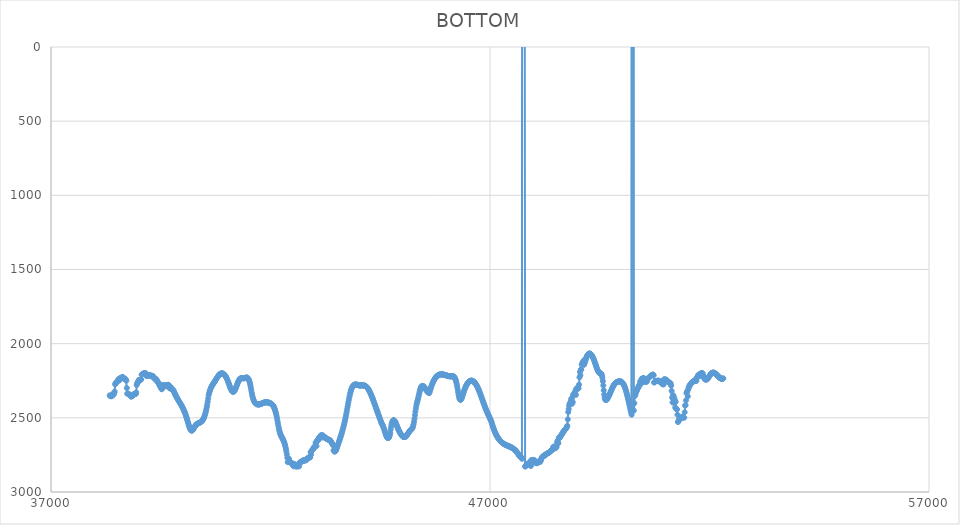
| Category | BOTTOM |
|---|---|
| 38337.5054 | 2348.22 |
| 38347.7454 | 2353.85 |
| 38357.9855 | 2353.85 |
| 38368.2256 | 2353.85 |
| 38378.4657 | 2353.85 |
| 38388.7057 | 2353.85 |
| 38398.9458 | 2344 |
| 38409.1859 | 2339.77 |
| 38419.426 | 2344 |
| 38429.666 | 2341.18 |
| 38439.9061 | 2332.74 |
| 38450.1462 | 2322.88 |
| 38460.3863 | 2273.62 |
| 38470.6263 | 2267.99 |
| 38480.8664 | 2263.76 |
| 38491.1065 | 2260.95 |
| 38501.3466 | 2258.13 |
| 38511.5866 | 2252.5 |
| 38521.8267 | 2252.5 |
| 38532.0668 | 2242.65 |
| 38542.3069 | 2241.24 |
| 38552.547 | 2237.02 |
| 38562.787 | 2246.87 |
| 38573.0271 | 2232.8 |
| 38583.2672 | 2229.98 |
| 38593.5073 | 2232.8 |
| 38603.7473 | 2231.39 |
| 38613.9874 | 2227.17 |
| 38624.2275 | 2227.17 |
| 38634.4676 | 2224.35 |
| 38644.7076 | 2228.57 |
| 38654.9477 | 2232.8 |
| 38665.1878 | 2235.61 |
| 38675.4279 | 2235.61 |
| 38685.6679 | 2237.02 |
| 38695.908 | 2239.83 |
| 38706.1481 | 2244.06 |
| 38716.3882 | 2249.69 |
| 38726.6282 | 2298.95 |
| 38736.8683 | 2336.96 |
| 38747.1084 | 2336.96 |
| 38757.3485 | 2336.96 |
| 38767.5886 | 2338.37 |
| 38777.8286 | 2341.18 |
| 38788.0687 | 2344 |
| 38798.3088 | 2345.41 |
| 38808.5489 | 2348.22 |
| 38818.7889 | 2356.67 |
| 38829.029 | 2355.26 |
| 38839.2691 | 2355.26 |
| 38849.5092 | 2353.85 |
| 38859.7492 | 2352.44 |
| 38869.9893 | 2346.81 |
| 38880.2294 | 2341.18 |
| 38890.4695 | 2341.18 |
| 38900.7095 | 2339.77 |
| 38910.9496 | 2338.37 |
| 38921.1897 | 2339.77 |
| 38931.4298 | 2339.77 |
| 38941.6698 | 2328.51 |
| 38951.9099 | 2279.25 |
| 38962.15 | 2266.58 |
| 38972.3901 | 2263.76 |
| 38982.6302 | 2253.91 |
| 38992.8702 | 2255.32 |
| 39003.1103 | 2244.06 |
| 39013.3504 | 2245.46 |
| 39023.5905 | 2244.06 |
| 39033.8305 | 2244.06 |
| 39044.0706 | 2242.65 |
| 39054.3107 | 2241.24 |
| 39064.5508 | 2208.87 |
| 39074.7908 | 2207.46 |
| 39085.0309 | 2204.64 |
| 39095.271 | 2204.64 |
| 39105.5111 | 2201.83 |
| 39115.7511 | 2200.42 |
| 39125.9912 | 2200.42 |
| 39136.2313 | 2200.42 |
| 39146.4714 | 2199.01 |
| 39156.7114 | 2200.42 |
| 39166.9515 | 2203.24 |
| 39177.1916 | 2218.72 |
| 39187.4317 | 2211.68 |
| 39197.6718 | 2215.9 |
| 39207.9118 | 2211.68 |
| 39218.1519 | 2213.09 |
| 39228.392 | 2215.9 |
| 39238.6321 | 2213.09 |
| 39248.8721 | 2213.09 |
| 39259.1122 | 2213.09 |
| 39269.3523 | 2214.5 |
| 39279.5924 | 2218.72 |
| 39289.8324 | 2215.9 |
| 39300.0725 | 2221.53 |
| 39310.3126 | 2217.31 |
| 39320.5527 | 2220.13 |
| 39330.7927 | 2220.13 |
| 39341.0328 | 2229.98 |
| 39351.2729 | 2229.98 |
| 39361.513 | 2235.61 |
| 39371.7531 | 2237.02 |
| 39381.9931 | 2242.65 |
| 39392.2332 | 2238.43 |
| 39402.4733 | 2242.65 |
| 39412.7134 | 2249.69 |
| 39422.9534 | 2253.91 |
| 39433.1935 | 2260.95 |
| 39443.4336 | 2262.36 |
| 39453.6737 | 2265.17 |
| 39463.9137 | 2276.43 |
| 39474.1538 | 2277.84 |
| 39484.3939 | 2284.88 |
| 39494.634 | 2293.32 |
| 39504.874 | 2294.73 |
| 39515.1141 | 2303.18 |
| 39525.3542 | 2307.4 |
| 39535.5943 | 2282.06 |
| 39545.8343 | 2282.06 |
| 39556.0744 | 2279.25 |
| 39566.3145 | 2280.65 |
| 39576.5546 | 2280.65 |
| 39586.7947 | 2280.65 |
| 39597.0347 | 2284.88 |
| 39607.2748 | 2287.69 |
| 39617.5149 | 2283.47 |
| 39627.755 | 2282.06 |
| 39637.995 | 2280.65 |
| 39648.2351 | 2280.65 |
| 39658.4752 | 2277.84 |
| 39668.7153 | 2277.84 |
| 39678.9553 | 2277.84 |
| 39689.1954 | 2282.06 |
| 39699.4355 | 2300.36 |
| 39709.6756 | 2300.36 |
| 39719.9156 | 2293.32 |
| 39730.1557 | 2293.32 |
| 39740.3958 | 2305.99 |
| 39750.6359 | 2307.4 |
| 39760.8759 | 2305.99 |
| 39771.116 | 2311.62 |
| 39781.3561 | 2313.03 |
| 39791.5962 | 2315.85 |
| 39801.8363 | 2323.48 |
| 39812.0763 | 2330.7 |
| 39822.3164 | 2337.54 |
| 39832.5565 | 2344.03 |
| 39842.7966 | 2350.21 |
| 39853.0366 | 2356.11 |
| 39863.2767 | 2361.77 |
| 39873.5168 | 2367.23 |
| 39883.7569 | 2372.53 |
| 39893.9969 | 2377.69 |
| 39904.237 | 2382.76 |
| 39914.4771 | 2387.77 |
| 39924.7172 | 2392.75 |
| 39934.9572 | 2397.75 |
| 39945.1973 | 2402.8 |
| 39955.4374 | 2407.93 |
| 39965.6775 | 2413.19 |
| 39975.9176 | 2418.6 |
| 39986.1576 | 2424.21 |
| 39996.3977 | 2430.04 |
| 40006.6378 | 2436.14 |
| 40016.8779 | 2442.55 |
| 40027.1179 | 2449.29 |
| 40037.358 | 2456.4 |
| 40047.5981 | 2463.92 |
| 40057.8382 | 2471.89 |
| 40068.0782 | 2480.34 |
| 40078.3183 | 2489.31 |
| 40088.5584 | 2498.84 |
| 40098.7985 | 2508.9 |
| 40109.0385 | 2519.3 |
| 40119.2786 | 2529.78 |
| 40129.5187 | 2540.09 |
| 40139.7588 | 2549.98 |
| 40149.9988 | 2559.18 |
| 40160.2389 | 2567.45 |
| 40170.479 | 2574.53 |
| 40180.7191 | 2580.17 |
| 40190.9592 | 2584.11 |
| 40201.1992 | 2586.11 |
| 40211.4393 | 2586 |
| 40221.6794 | 2584.07 |
| 40231.9195 | 2580.68 |
| 40242.1595 | 2576.22 |
| 40252.3996 | 2571.06 |
| 40262.6397 | 2565.57 |
| 40272.8798 | 2560.14 |
| 40283.1198 | 2555.14 |
| 40293.3599 | 2550.87 |
| 40303.6 | 2547.3 |
| 40313.8401 | 2544.36 |
| 40324.0801 | 2541.93 |
| 40334.3202 | 2539.92 |
| 40344.5603 | 2538.25 |
| 40354.8004 | 2536.8 |
| 40365.0405 | 2535.5 |
| 40375.2805 | 2534.24 |
| 40385.5206 | 2532.92 |
| 40395.7607 | 2531.45 |
| 40406.0008 | 2529.74 |
| 40416.2408 | 2527.69 |
| 40426.4809 | 2525.2 |
| 40436.721 | 2522.19 |
| 40446.9611 | 2518.54 |
| 40457.2011 | 2514.17 |
| 40467.4412 | 2508.99 |
| 40477.6813 | 2502.89 |
| 40487.9214 | 2495.79 |
| 40498.1614 | 2487.57 |
| 40508.4015 | 2478.16 |
| 40518.6416 | 2467.46 |
| 40528.8817 | 2455.36 |
| 40539.1218 | 2441.78 |
| 40549.3618 | 2426.61 |
| 40559.6019 | 2409.77 |
| 40569.842 | 2391.15 |
| 40580.0821 | 2370.67 |
| 40590.3221 | 2348.22 |
| 40600.5622 | 2335.66 |
| 40610.8023 | 2324.6 |
| 40621.0424 | 2314.87 |
| 40631.2824 | 2306.34 |
| 40641.5225 | 2298.83 |
| 40651.7626 | 2292.21 |
| 40662.0027 | 2286.31 |
| 40672.2427 | 2280.99 |
| 40682.4828 | 2276.08 |
| 40692.7229 | 2271.44 |
| 40702.963 | 2266.92 |
| 40713.2031 | 2262.36 |
| 40723.4431 | 2257.63 |
| 40733.6832 | 2252.77 |
| 40743.9233 | 2247.83 |
| 40754.1634 | 2242.86 |
| 40764.4034 | 2237.92 |
| 40774.6435 | 2233.06 |
| 40784.8836 | 2228.34 |
| 40795.1237 | 2223.81 |
| 40805.3637 | 2219.54 |
| 40815.6038 | 2215.57 |
| 40825.8439 | 2211.96 |
| 40836.084 | 2208.77 |
| 40846.324 | 2206.05 |
| 40856.5641 | 2203.85 |
| 40866.8042 | 2202.18 |
| 40877.0443 | 2201.05 |
| 40887.2843 | 2200.47 |
| 40897.5244 | 2200.44 |
| 40907.7645 | 2200.97 |
| 40918.0046 | 2202.07 |
| 40928.2447 | 2203.73 |
| 40938.4847 | 2205.97 |
| 40948.7248 | 2208.8 |
| 40958.9649 | 2212.22 |
| 40969.205 | 2216.23 |
| 40979.445 | 2220.85 |
| 40989.6851 | 2226.07 |
| 40999.9252 | 2231.91 |
| 41010.1653 | 2238.37 |
| 41020.4053 | 2245.46 |
| 41030.6454 | 2253.16 |
| 41040.8855 | 2261.29 |
| 41051.1256 | 2269.67 |
| 41061.3656 | 2278.1 |
| 41071.6057 | 2286.38 |
| 41081.8458 | 2294.34 |
| 41092.0859 | 2301.76 |
| 41102.326 | 2308.46 |
| 41112.566 | 2314.23 |
| 41122.8061 | 2318.9 |
| 41133.0462 | 2322.26 |
| 41143.2863 | 2324.12 |
| 41153.5263 | 2324.29 |
| 41163.7664 | 2322.64 |
| 41174.0065 | 2319.35 |
| 41184.2466 | 2314.65 |
| 41194.4866 | 2308.79 |
| 41204.7267 | 2302.02 |
| 41214.9668 | 2294.58 |
| 41225.2069 | 2286.71 |
| 41235.4469 | 2278.64 |
| 41245.687 | 2270.64 |
| 41255.9271 | 2262.94 |
| 41266.1672 | 2255.78 |
| 41276.4073 | 2249.4 |
| 41286.6473 | 2244.06 |
| 41296.8874 | 2239.92 |
| 41307.1275 | 2236.89 |
| 41317.3676 | 2234.8 |
| 41327.6076 | 2233.51 |
| 41337.8477 | 2232.83 |
| 41348.0878 | 2232.62 |
| 41358.3279 | 2232.71 |
| 41368.5679 | 2232.93 |
| 41378.808 | 2233.13 |
| 41389.0481 | 2233.14 |
| 41399.2882 | 2232.8 |
| 41409.5282 | 2232.01 |
| 41419.7683 | 2230.94 |
| 41430.0084 | 2229.84 |
| 41440.2485 | 2228.92 |
| 41450.4886 | 2228.43 |
| 41460.7286 | 2228.61 |
| 41470.9687 | 2229.68 |
| 41481.2088 | 2231.88 |
| 41491.4489 | 2235.46 |
| 41501.6889 | 2240.63 |
| 41511.929 | 2247.65 |
| 41522.1691 | 2256.73 |
| 41532.4092 | 2268.13 |
| 41542.6492 | 2282.06 |
| 41552.8893 | 2298.45 |
| 41563.1294 | 2315.91 |
| 41573.3695 | 2332.74 |
| 41583.6095 | 2347.53 |
| 41593.8496 | 2360.16 |
| 41604.0897 | 2370.83 |
| 41614.3298 | 2379.7 |
| 41624.5699 | 2386.98 |
| 41634.8099 | 2392.85 |
| 41645.05 | 2397.49 |
| 41655.2901 | 2401.09 |
| 41665.5302 | 2403.85 |
| 41675.7702 | 2405.93 |
| 41686.0103 | 2407.52 |
| 41696.2504 | 2408.66 |
| 41706.4905 | 2409.4 |
| 41716.7305 | 2409.77 |
| 41726.9706 | 2409.8 |
| 41737.2107 | 2409.55 |
| 41747.4508 | 2409.03 |
| 41757.6908 | 2408.3 |
| 41767.9309 | 2407.38 |
| 41778.171 | 2406.31 |
| 41788.4111 | 2405.13 |
| 41798.6512 | 2403.87 |
| 41808.8912 | 2402.58 |
| 41819.1313 | 2401.29 |
| 41829.3714 | 2400.03 |
| 41839.6115 | 2398.84 |
| 41849.8515 | 2397.76 |
| 41860.0916 | 2396.83 |
| 41870.3317 | 2396.08 |
| 41880.5718 | 2395.54 |
| 41890.8118 | 2395.21 |
| 41901.0519 | 2395.09 |
| 41911.292 | 2395.15 |
| 41921.5321 | 2395.41 |
| 41931.7722 | 2395.84 |
| 41942.0122 | 2396.44 |
| 41952.2523 | 2397.21 |
| 41962.4924 | 2398.12 |
| 41972.7325 | 2399.18 |
| 41982.9725 | 2400.38 |
| 41993.2126 | 2401.71 |
| 42003.4527 | 2403.18 |
| 42013.6928 | 2404.88 |
| 42023.9328 | 2406.93 |
| 42034.1729 | 2409.45 |
| 42044.413 | 2412.54 |
| 42054.6531 | 2416.32 |
| 42064.8931 | 2420.91 |
| 42075.1332 | 2426.41 |
| 42085.3733 | 2432.95 |
| 42095.6134 | 2440.63 |
| 42105.8535 | 2449.58 |
| 42116.0935 | 2459.9 |
| 42126.3336 | 2471.7 |
| 42136.5737 | 2485.12 |
| 42146.8138 | 2500.24 |
| 42157.0538 | 2517.01 |
| 42167.2939 | 2534.56 |
| 42177.534 | 2551.84 |
| 42187.7741 | 2567.81 |
| 42198.0141 | 2581.64 |
| 42208.2542 | 2593.42 |
| 42218.4943 | 2603.43 |
| 42228.7344 | 2611.99 |
| 42238.9744 | 2619.38 |
| 42249.2145 | 2625.91 |
| 42259.4546 | 2631.89 |
| 42269.6947 | 2637.6 |
| 42279.9348 | 2643.36 |
| 42290.1748 | 2649.45 |
| 42300.4149 | 2656.18 |
| 42310.655 | 2663.86 |
| 42320.8951 | 2672.77 |
| 42331.1351 | 2683.23 |
| 42341.3752 | 2695.52 |
| 42351.6153 | 2709.95 |
| 42361.8554 | 2726.83 |
| 42372.0954 | 2746.44 |
| 42382.3355 | 2769.1 |
| 42392.5756 | 2798.66 |
| 42402.8157 | 2773.32 |
| 42413.0557 | 2794.43 |
| 42423.2958 | 2777.54 |
| 42433.5359 | 2797.25 |
| 42443.776 | 2797.25 |
| 42454.0161 | 2801.47 |
| 42464.2561 | 2804.29 |
| 42474.4962 | 2804.29 |
| 42484.7363 | 2805.7 |
| 42494.9764 | 2807.1 |
| 42505.2164 | 2808.51 |
| 42515.4565 | 2821.18 |
| 42525.6966 | 2826.81 |
| 42535.9367 | 2814.14 |
| 42546.1767 | 2814.14 |
| 42556.4168 | 2814.14 |
| 42566.6569 | 2816.96 |
| 42576.897 | 2828.22 |
| 42587.1371 | 2826.81 |
| 42597.3771 | 2825.4 |
| 42607.6172 | 2826.81 |
| 42617.8573 | 2826.81 |
| 42628.0974 | 2825.4 |
| 42638.3374 | 2826.81 |
| 42648.5775 | 2826.81 |
| 42658.8176 | 2802.88 |
| 42669.0577 | 2801.47 |
| 42679.2977 | 2800.07 |
| 42689.5378 | 2798.66 |
| 42699.7779 | 2797.25 |
| 42710.018 | 2795.84 |
| 42720.258 | 2790.21 |
| 42730.4981 | 2790.21 |
| 42740.7382 | 2788.8 |
| 42750.9783 | 2788.8 |
| 42761.2184 | 2784.58 |
| 42771.4584 | 2790.21 |
| 42781.6985 | 2785.99 |
| 42791.9386 | 2783.17 |
| 42802.1787 | 2783.17 |
| 42812.4187 | 2785.99 |
| 42822.6588 | 2778.95 |
| 42832.8989 | 2774.73 |
| 42843.139 | 2773.32 |
| 42853.379 | 2771.91 |
| 42863.6191 | 2769.1 |
| 42873.8592 | 2767.69 |
| 42884.0993 | 2766.28 |
| 42894.3393 | 2766.28 |
| 42904.5794 | 2766.28 |
| 42914.8195 | 2731.09 |
| 42925.0596 | 2747.98 |
| 42935.2997 | 2724.05 |
| 42945.5397 | 2719.83 |
| 42955.7798 | 2714.2 |
| 42966.0199 | 2711.39 |
| 42976.26 | 2708.57 |
| 42986.5 | 2704.35 |
| 42996.7401 | 2694.49 |
| 43006.9802 | 2694.49 |
| 43017.2203 | 2693.09 |
| 43027.4603 | 2667.75 |
| 43037.7004 | 2664.93 |
| 43047.9405 | 2690.27 |
| 43058.1806 | 2655.08 |
| 43068.4207 | 2652.27 |
| 43078.6607 | 2650.86 |
| 43088.9008 | 2649.45 |
| 43099.1409 | 2636.78 |
| 43109.381 | 2633.97 |
| 43119.621 | 2632.56 |
| 43129.8611 | 2632.56 |
| 43140.1012 | 2621.3 |
| 43150.3413 | 2617.08 |
| 43160.5813 | 2629.74 |
| 43170.8214 | 2632.56 |
| 43181.0615 | 2617.08 |
| 43191.3016 | 2618.48 |
| 43201.5416 | 2631.15 |
| 43211.7817 | 2629.74 |
| 43222.0218 | 2631.15 |
| 43232.2619 | 2631.15 |
| 43242.502 | 2632.56 |
| 43252.742 | 2632.56 |
| 43262.9821 | 2638.19 |
| 43273.2222 | 2639.6 |
| 43283.4623 | 2641 |
| 43293.7023 | 2643.82 |
| 43303.9424 | 2645.23 |
| 43314.1825 | 2646.63 |
| 43324.4226 | 2646.63 |
| 43334.6626 | 2649.45 |
| 43344.9027 | 2649.45 |
| 43355.1428 | 2649.45 |
| 43365.3829 | 2656.49 |
| 43375.623 | 2657.9 |
| 43385.863 | 2663.53 |
| 43396.1031 | 2670.56 |
| 43406.3432 | 2676.19 |
| 43416.5833 | 2677.6 |
| 43426.8233 | 2686.05 |
| 43437.0634 | 2719.83 |
| 43447.3035 | 2717.02 |
| 43457.5436 | 2728.28 |
| 43467.7836 | 2725.46 |
| 43478.0237 | 2724.05 |
| 43488.2638 | 2721.24 |
| 43498.5039 | 2714.2 |
| 43508.7439 | 2705.05 |
| 43518.984 | 2696.05 |
| 43529.2241 | 2687.16 |
| 43539.4642 | 2678.34 |
| 43549.7043 | 2669.53 |
| 43559.9443 | 2660.69 |
| 43570.1844 | 2651.77 |
| 43580.4245 | 2642.73 |
| 43590.6646 | 2633.53 |
| 43600.9046 | 2624.11 |
| 43611.1447 | 2614.44 |
| 43621.3848 | 2604.45 |
| 43631.6249 | 2594.12 |
| 43641.8649 | 2583.39 |
| 43652.105 | 2572.22 |
| 43662.3451 | 2560.55 |
| 43672.5852 | 2548.35 |
| 43682.8253 | 2535.57 |
| 43693.0653 | 2522.17 |
| 43703.3054 | 2508.09 |
| 43713.5455 | 2493.29 |
| 43723.7856 | 2477.72 |
| 43734.0256 | 2461.4 |
| 43744.2657 | 2444.53 |
| 43754.5058 | 2427.4 |
| 43764.7459 | 2410.27 |
| 43774.9859 | 2393.42 |
| 43785.226 | 2377.1 |
| 43795.4661 | 2361.61 |
| 43805.7062 | 2347.2 |
| 43815.9462 | 2334.14 |
| 43826.1863 | 2322.66 |
| 43836.4264 | 2312.7 |
| 43846.6665 | 2304.17 |
| 43856.9066 | 2296.97 |
| 43867.1466 | 2291.01 |
| 43877.3867 | 2286.17 |
| 43887.6268 | 2282.36 |
| 43897.8669 | 2279.48 |
| 43908.1069 | 2277.43 |
| 43918.347 | 2276.11 |
| 43928.5871 | 2275.42 |
| 43938.8272 | 2275.27 |
| 43949.0672 | 2275.54 |
| 43959.3073 | 2276.15 |
| 43969.5474 | 2276.98 |
| 43979.7875 | 2277.95 |
| 43990.0276 | 2278.95 |
| 44000.2676 | 2279.89 |
| 44010.5077 | 2280.65 |
| 44020.7478 | 2281.18 |
| 44030.9879 | 2281.48 |
| 44041.2279 | 2281.6 |
| 44051.468 | 2281.6 |
| 44061.7081 | 2281.51 |
| 44071.9482 | 2281.38 |
| 44082.1882 | 2281.25 |
| 44092.4283 | 2281.18 |
| 44102.6684 | 2281.21 |
| 44112.9085 | 2281.37 |
| 44123.1486 | 2281.73 |
| 44133.3886 | 2282.32 |
| 44143.6287 | 2283.19 |
| 44153.8688 | 2284.38 |
| 44164.1089 | 2285.95 |
| 44174.3489 | 2287.93 |
| 44184.589 | 2290.37 |
| 44194.8291 | 2293.32 |
| 44205.0692 | 2296.81 |
| 44215.3092 | 2300.83 |
| 44225.5493 | 2305.34 |
| 44235.7894 | 2310.32 |
| 44246.0295 | 2315.73 |
| 44256.2695 | 2321.55 |
| 44266.5096 | 2327.76 |
| 44276.7497 | 2334.31 |
| 44286.9898 | 2341.19 |
| 44297.2299 | 2348.36 |
| 44307.4699 | 2355.79 |
| 44317.71 | 2363.46 |
| 44327.9501 | 2371.34 |
| 44338.1902 | 2379.4 |
| 44348.4302 | 2387.6 |
| 44358.6703 | 2395.93 |
| 44368.9104 | 2404.35 |
| 44379.1505 | 2412.83 |
| 44389.3905 | 2421.34 |
| 44399.6306 | 2429.86 |
| 44409.8707 | 2438.36 |
| 44420.1108 | 2446.84 |
| 44430.3509 | 2455.29 |
| 44440.5909 | 2463.72 |
| 44450.831 | 2472.12 |
| 44461.0711 | 2480.49 |
| 44471.3112 | 2488.83 |
| 44481.5512 | 2497.15 |
| 44491.7913 | 2505.43 |
| 44502.0314 | 2513.68 |
| 44512.2715 | 2521.9 |
| 44522.5115 | 2530.09 |
| 44532.7516 | 2538.25 |
| 44542.9917 | 2542.61 |
| 44553.2318 | 2548.6 |
| 44563.4719 | 2555.93 |
| 44573.7119 | 2564.28 |
| 44583.952 | 2573.34 |
| 44594.1921 | 2582.82 |
| 44604.4322 | 2592.39 |
| 44614.6722 | 2601.75 |
| 44624.9123 | 2610.6 |
| 44635.1524 | 2618.63 |
| 44645.3925 | 2625.52 |
| 44655.6325 | 2630.98 |
| 44665.8726 | 2634.68 |
| 44676.1127 | 2636.33 |
| 44686.3528 | 2635.62 |
| 44696.5929 | 2632.24 |
| 44706.8329 | 2625.88 |
| 44717.073 | 2616.24 |
| 44727.3131 | 2603 |
| 44737.5532 | 2579.22 |
| 44747.7932 | 2559.78 |
| 44758.0333 | 2544.35 |
| 44768.2734 | 2532.62 |
| 44778.5135 | 2524.26 |
| 44788.7535 | 2518.95 |
| 44798.9936 | 2516.36 |
| 44809.2337 | 2516.18 |
| 44819.4738 | 2518.08 |
| 44829.7139 | 2521.74 |
| 44839.9539 | 2526.83 |
| 44850.194 | 2533.05 |
| 44860.4341 | 2540.05 |
| 44870.6742 | 2547.52 |
| 44880.9142 | 2555.14 |
| 44891.1543 | 2562.63 |
| 44901.3944 | 2569.91 |
| 44911.6345 | 2576.95 |
| 44921.8745 | 2583.7 |
| 44932.1146 | 2590.14 |
| 44942.3547 | 2596.22 |
| 44952.5948 | 2601.91 |
| 44962.8348 | 2607.18 |
| 44973.0749 | 2611.99 |
| 44983.315 | 2616.3 |
| 44993.5551 | 2620.08 |
| 45003.7952 | 2623.29 |
| 45014.0352 | 2625.91 |
| 45024.2753 | 2627.88 |
| 45034.5154 | 2629.18 |
| 45044.7555 | 2629.77 |
| 45054.9955 | 2629.61 |
| 45065.2356 | 2628.68 |
| 45075.4757 | 2626.93 |
| 45085.7158 | 2624.36 |
| 45095.9558 | 2621.07 |
| 45106.1959 | 2617.23 |
| 45116.436 | 2612.96 |
| 45126.6761 | 2608.41 |
| 45136.9162 | 2603.73 |
| 45147.1562 | 2599.05 |
| 45157.3963 | 2594.53 |
| 45167.6364 | 2590.3 |
| 45177.8765 | 2586.5 |
| 45188.1165 | 2583.29 |
| 45198.3566 | 2580.67 |
| 45208.5967 | 2578.09 |
| 45218.8368 | 2574.88 |
| 45229.0768 | 2570.35 |
| 45239.3169 | 2563.84 |
| 45249.557 | 2554.66 |
| 45259.7971 | 2542.13 |
| 45270.0372 | 2525.58 |
| 45280.2772 | 2504.81 |
| 45290.5173 | 2481.6 |
| 45300.7574 | 2458.21 |
| 45310.9975 | 2436.9 |
| 45321.2375 | 2419.36 |
| 45331.4776 | 2404.99 |
| 45341.7177 | 2392.64 |
| 45351.9578 | 2381.14 |
| 45362.1978 | 2369.33 |
| 45372.4379 | 2356.39 |
| 45382.678 | 2342.78 |
| 45392.9181 | 2329.31 |
| 45403.1582 | 2316.78 |
| 45413.3982 | 2305.99 |
| 45423.6383 | 2297.58 |
| 45433.8784 | 2291.49 |
| 45444.1185 | 2287.49 |
| 45454.3585 | 2285.35 |
| 45464.5986 | 2284.84 |
| 45474.8387 | 2285.73 |
| 45485.0788 | 2287.79 |
| 45495.3188 | 2290.8 |
| 45505.5589 | 2294.52 |
| 45515.799 | 2298.72 |
| 45526.0391 | 2303.18 |
| 45536.2792 | 2307.68 |
| 45546.5192 | 2312.11 |
| 45556.7593 | 2316.37 |
| 45566.9994 | 2320.35 |
| 45577.2395 | 2323.97 |
| 45587.4795 | 2327.11 |
| 45597.7196 | 2329.69 |
| 45607.9597 | 2331.59 |
| 45618.1998 | 2332.74 |
| 45628.4398 | 2321.52 |
| 45638.6799 | 2310.96 |
| 45648.92 | 2301.03 |
| 45659.1601 | 2291.72 |
| 45669.4002 | 2283.01 |
| 45679.6402 | 2274.89 |
| 45689.8803 | 2267.33 |
| 45700.1204 | 2260.31 |
| 45710.3605 | 2253.82 |
| 45720.6005 | 2247.85 |
| 45730.8406 | 2242.36 |
| 45741.0807 | 2237.35 |
| 45751.3208 | 2232.8 |
| 45761.5608 | 2228.68 |
| 45771.8009 | 2224.98 |
| 45782.041 | 2221.69 |
| 45792.2811 | 2218.77 |
| 45802.5212 | 2216.23 |
| 45812.7612 | 2214.03 |
| 45823.0013 | 2212.16 |
| 45833.2414 | 2210.6 |
| 45843.4815 | 2209.34 |
| 45853.7215 | 2208.35 |
| 45863.9616 | 2207.62 |
| 45874.2017 | 2207.13 |
| 45884.4418 | 2206.86 |
| 45894.6818 | 2206.79 |
| 45904.9219 | 2206.9 |
| 45915.162 | 2207.19 |
| 45925.4021 | 2207.62 |
| 45935.6422 | 2208.19 |
| 45945.8822 | 2208.86 |
| 45956.1223 | 2209.63 |
| 45966.3624 | 2210.48 |
| 45976.6025 | 2211.39 |
| 45986.8425 | 2212.34 |
| 45997.0826 | 2213.31 |
| 46007.3227 | 2214.28 |
| 46017.5628 | 2215.24 |
| 46027.8028 | 2216.17 |
| 46038.0429 | 2217.05 |
| 46048.283 | 2217.86 |
| 46058.5231 | 2218.59 |
| 46068.7632 | 2219.21 |
| 46079.0032 | 2219.71 |
| 46089.2433 | 2220.07 |
| 46099.4834 | 2220.27 |
| 46109.7235 | 2220.3 |
| 46119.9635 | 2220.13 |
| 46130.2036 | 2219.79 |
| 46140.4437 | 2219.49 |
| 46150.6838 | 2219.48 |
| 46160.9238 | 2220.01 |
| 46171.1639 | 2221.33 |
| 46181.404 | 2223.68 |
| 46191.6441 | 2227.32 |
| 46201.8842 | 2232.51 |
| 46212.1242 | 2239.47 |
| 46222.3643 | 2248.48 |
| 46232.6044 | 2259.78 |
| 46242.8445 | 2273.62 |
| 46253.0845 | 2289.99 |
| 46263.3246 | 2307.88 |
| 46273.5647 | 2326.03 |
| 46283.8048 | 2343.17 |
| 46294.0448 | 2358.02 |
| 46304.2849 | 2369.33 |
| 46314.525 | 2376.14 |
| 46324.7651 | 2378.74 |
| 46335.0052 | 2377.74 |
| 46345.2452 | 2373.73 |
| 46355.4853 | 2367.34 |
| 46365.7254 | 2359.15 |
| 46375.9655 | 2349.79 |
| 46386.2055 | 2339.84 |
| 46396.4456 | 2329.92 |
| 46406.6857 | 2320.53 |
| 46416.9258 | 2311.77 |
| 46427.1658 | 2303.62 |
| 46437.4059 | 2296.08 |
| 46447.646 | 2289.13 |
| 46457.8861 | 2282.78 |
| 46468.1262 | 2277 |
| 46478.3662 | 2271.8 |
| 46488.6063 | 2267.17 |
| 46498.8464 | 2263.09 |
| 46509.0865 | 2259.56 |
| 46519.3265 | 2256.56 |
| 46529.5666 | 2254.1 |
| 46539.8067 | 2252.16 |
| 46550.0468 | 2250.74 |
| 46560.2868 | 2249.82 |
| 46570.5269 | 2249.4 |
| 46580.767 | 2249.46 |
| 46591.0071 | 2250.01 |
| 46601.2472 | 2251.02 |
| 46611.4872 | 2252.5 |
| 46621.7273 | 2254.44 |
| 46631.9674 | 2256.83 |
| 46642.2075 | 2259.67 |
| 46652.4475 | 2262.97 |
| 46662.6876 | 2266.73 |
| 46672.9277 | 2270.94 |
| 46683.1678 | 2275.6 |
| 46693.4078 | 2280.71 |
| 46703.6479 | 2286.29 |
| 46713.888 | 2292.3 |
| 46724.1281 | 2298.74 |
| 46734.3682 | 2305.55 |
| 46744.6082 | 2312.71 |
| 46754.8483 | 2320.17 |
| 46765.0884 | 2327.89 |
| 46775.3285 | 2335.85 |
| 46785.5685 | 2343.99 |
| 46795.8086 | 2352.29 |
| 46806.0487 | 2360.71 |
| 46816.2888 | 2369.2 |
| 46826.5289 | 2377.74 |
| 46836.7689 | 2386.28 |
| 46847.009 | 2394.78 |
| 46857.2491 | 2403.22 |
| 46867.4892 | 2411.54 |
| 46877.7292 | 2419.72 |
| 46887.9693 | 2427.72 |
| 46898.2094 | 2435.49 |
| 46908.4495 | 2443.02 |
| 46918.6895 | 2450.32 |
| 46928.9296 | 2457.43 |
| 46939.1697 | 2464.39 |
| 46949.4098 | 2471.22 |
| 46959.6499 | 2477.97 |
| 46969.8899 | 2484.66 |
| 46980.13 | 2491.33 |
| 46990.3701 | 2498.01 |
| 47000.6102 | 2504.75 |
| 47010.8502 | 2511.56 |
| 47021.0903 | 2518.5 |
| 47031.3304 | 2525.58 |
| 47041.5705 | 2536.01 |
| 47051.8105 | 2545.95 |
| 47062.0506 | 2555.4 |
| 47072.2907 | 2564.4 |
| 47082.5308 | 2572.94 |
| 47092.7709 | 2581.05 |
| 47103.0109 | 2588.73 |
| 47113.251 | 2596 |
| 47123.4911 | 2602.88 |
| 47133.7312 | 2609.37 |
| 47143.9712 | 2615.49 |
| 47154.2113 | 2621.26 |
| 47164.4514 | 2626.68 |
| 47174.6915 | 2631.78 |
| 47184.9315 | 2636.56 |
| 47195.1716 | 2641.04 |
| 47205.4117 | 2645.23 |
| 47215.6518 | 2649.14 |
| 47225.8919 | 2652.8 |
| 47236.1319 | 2656.2 |
| 47246.372 | 2659.37 |
| 47256.6121 | 2662.32 |
| 47266.8522 | 2665.07 |
| 47277.0922 | 2667.62 |
| 47287.3323 | 2669.99 |
| 47297.5724 | 2672.2 |
| 47307.8125 | 2674.25 |
| 47318.0525 | 2676.16 |
| 47328.2926 | 2677.95 |
| 47338.5327 | 2679.62 |
| 47348.7728 | 2681.2 |
| 47359.0129 | 2682.69 |
| 47369.2529 | 2684.11 |
| 47379.493 | 2685.47 |
| 47389.7331 | 2686.79 |
| 47399.9732 | 2688.07 |
| 47410.2132 | 2689.34 |
| 47420.4533 | 2690.61 |
| 47430.6934 | 2691.88 |
| 47440.9335 | 2693.18 |
| 47451.1736 | 2694.52 |
| 47461.4136 | 2695.9 |
| 47471.6537 | 2697.35 |
| 47481.8938 | 2698.88 |
| 47492.1339 | 2700.5 |
| 47502.3739 | 2702.22 |
| 47512.614 | 2704.06 |
| 47522.8541 | 2706.03 |
| 47533.0942 | 2708.15 |
| 47543.3342 | 2710.43 |
| 47553.5743 | 2712.88 |
| 47563.8144 | 2715.51 |
| 47574.0545 | 2718.35 |
| 47584.2946 | 2721.4 |
| 47594.5346 | 2724.67 |
| 47604.7747 | 2728.19 |
| 47615.0148 | 2731.95 |
| 47625.2549 | 2735.99 |
| 47635.4949 | 2740.31 |
| 47645.735 | 2744.92 |
| 47655.9751 | 2749.84 |
| 47666.2152 | 2755.08 |
| 47676.4552 | 2760.65 |
| 47686.6953 | 2759.24 |
| 47696.9354 | 2760.65 |
| 47707.1755 | 2767.69 |
| 47717.4156 | 2769.1 |
| 47727.6556 | 2776.14 |
| 47737.8957 | -9999 |
| 47748.1358 | -9999 |
| 47758.3759 | -9999 |
| 47768.6159 | -9999 |
| 47778.856 | -9999 |
| 47789.0961 | -9999 |
| 47799.3362 | 2828.22 |
| 47809.5763 | 2826.81 |
| 47819.8163 | 2823.99 |
| 47830.0564 | 2815.55 |
| 47840.2965 | 2814.14 |
| 47850.5366 | 2811.33 |
| 47860.7766 | 2811.33 |
| 47871.0167 | 2809.92 |
| 47881.2568 | 2809.92 |
| 47891.4969 | 2809.92 |
| 47901.7369 | 2811.33 |
| 47911.977 | 2795.84 |
| 47922.2171 | 2822.59 |
| 47932.4572 | 2823.99 |
| 47942.6973 | 2784.58 |
| 47952.9373 | 2785.99 |
| 47963.1774 | 2785.99 |
| 47973.4175 | 2785.99 |
| 47983.6576 | 2783.17 |
| 47993.8976 | 2784.58 |
| 48004.1377 | 2784.58 |
| 48014.3778 | 2795.84 |
| 48024.6179 | 2801.47 |
| 48034.8579 | 2793.03 |
| 48045.098 | 2801.47 |
| 48055.3381 | 2805.7 |
| 48065.5782 | 2805.7 |
| 48075.8183 | 2804.29 |
| 48086.0583 | 2804.29 |
| 48096.2984 | 2797.25 |
| 48106.5385 | 2795.84 |
| 48116.7786 | 2791.62 |
| 48127.0186 | 2791.62 |
| 48137.2587 | 2798.66 |
| 48147.4988 | 2788.8 |
| 48157.7389 | 2788.8 |
| 48167.9789 | 2777.54 |
| 48178.219 | 2769.1 |
| 48188.4591 | 2764.87 |
| 48198.6992 | 2760.65 |
| 48208.9393 | 2760.65 |
| 48219.1793 | 2757.84 |
| 48229.4194 | 2757.84 |
| 48239.6595 | 2756.43 |
| 48249.8996 | 2749.39 |
| 48260.1396 | 2747.98 |
| 48270.3797 | 2747.98 |
| 48280.6198 | 2745.17 |
| 48290.8599 | 2742.35 |
| 48301.1 | 2740.95 |
| 48311.34 | 2739.54 |
| 48321.5801 | 2736.72 |
| 48331.8202 | 2736.72 |
| 48342.0603 | 2735.31 |
| 48352.3003 | 2732.5 |
| 48362.5404 | 2728.28 |
| 48372.7805 | 2726.87 |
| 48383.0206 | 2725.46 |
| 48393.2606 | 2721.24 |
| 48403.5007 | 2718.42 |
| 48413.7408 | 2717.02 |
| 48423.9809 | 2711.39 |
| 48434.221 | 2702.94 |
| 48444.461 | 2694.49 |
| 48454.7011 | 2707.16 |
| 48464.9412 | 2707.16 |
| 48475.1813 | 2702.94 |
| 48485.4213 | 2702.94 |
| 48495.6614 | 2704.35 |
| 48505.9015 | 2697.31 |
| 48516.1416 | 2697.31 |
| 48526.3817 | 2667.75 |
| 48536.6217 | 2655.08 |
| 48546.8618 | 2671.97 |
| 48557.1019 | 2669.16 |
| 48567.342 | 2633.97 |
| 48577.582 | 2635.37 |
| 48587.8221 | 2633.97 |
| 48598.0622 | 2631.15 |
| 48608.3023 | 2622.71 |
| 48618.5423 | 2619.89 |
| 48628.7824 | 2612.85 |
| 48639.0225 | 2610.04 |
| 48649.2626 | 2605.81 |
| 48659.5027 | 2600.18 |
| 48669.7427 | 2593.15 |
| 48679.9828 | 2591.74 |
| 48690.2229 | 2584.7 |
| 48700.463 | 2581.88 |
| 48710.703 | 2579.07 |
| 48720.9431 | 2576.25 |
| 48731.1832 | 2570.62 |
| 48741.4233 | 2569.22 |
| 48751.6634 | 2560.77 |
| 48761.9034 | 2553.73 |
| 48772.1435 | 2510.1 |
| 48782.3836 | 2460.83 |
| 48792.6237 | 2441.12 |
| 48802.8637 | 2418.6 |
| 48813.1038 | 2404.53 |
| 48823.3439 | 2403.12 |
| 48833.584 | 2396.08 |
| 48843.824 | 2382 |
| 48854.0641 | 2370.74 |
| 48864.3042 | 2367.93 |
| 48874.5443 | 2404.53 |
| 48884.7844 | 2393.26 |
| 48895.0244 | 2344 |
| 48905.2645 | 2344 |
| 48915.5046 | 2341.18 |
| 48925.7447 | 2331.33 |
| 48935.9847 | 2329.92 |
| 48946.2248 | 2317.25 |
| 48956.4649 | 2345.41 |
| 48966.705 | 2303.18 |
| 48976.945 | 2303.18 |
| 48987.1851 | 2303.18 |
| 48997.4252 | 2304.58 |
| 49007.6653 | 2291.92 |
| 49017.9054 | 2300.36 |
| 49028.1454 | 2276.43 |
| 49038.3855 | 2227.17 |
| 49048.6256 | 2190.57 |
| 49058.8657 | 2213.09 |
| 49069.1057 | 2175.08 |
| 49079.3458 | 2175.08 |
| 49089.5859 | 2142.71 |
| 49099.826 | 2135.67 |
| 49110.0661 | 2127.22 |
| 49120.3061 | 2123 |
| 49130.5462 | 2117.37 |
| 49140.7863 | 2142.71 |
| 49151.0264 | 2108.93 |
| 49161.2664 | 2128.63 |
| 49171.5065 | 2116.49 |
| 49181.7466 | 2105.8 |
| 49191.9867 | 2096.51 |
| 49202.2267 | 2088.58 |
| 49212.4668 | 2081.97 |
| 49222.7069 | 2076.61 |
| 49232.947 | 2072.48 |
| 49243.1871 | 2069.51 |
| 49253.4271 | 2067.67 |
| 49263.6672 | 2066.9 |
| 49273.9073 | 2067.16 |
| 49284.1474 | 2068.4 |
| 49294.3874 | 2070.58 |
| 49304.6275 | 2073.64 |
| 49314.8676 | 2077.55 |
| 49325.1077 | 2082.24 |
| 49335.3478 | 2087.68 |
| 49345.5878 | 2093.82 |
| 49355.8279 | 2100.61 |
| 49366.068 | 2108.01 |
| 49376.3081 | 2115.96 |
| 49386.5481 | 2124.4 |
| 49396.7882 | 2133.17 |
| 49407.0283 | 2142.09 |
| 49417.2684 | 2150.97 |
| 49427.5084 | 2159.64 |
| 49437.7485 | 2167.91 |
| 49447.9886 | 2175.6 |
| 49458.2287 | 2182.53 |
| 49468.4688 | 2188.52 |
| 49478.7088 | 2193.38 |
| 49488.9489 | 2196.94 |
| 49499.189 | 2199.01 |
| 49509.4291 | 2199.7 |
| 49519.6691 | 2200.21 |
| 49529.9092 | 2202.04 |
| 49540.1493 | 2206.69 |
| 49550.3894 | 2215.66 |
| 49560.6295 | 2230.43 |
| 49570.8695 | 2252.5 |
| 49581.1096 | 2282.08 |
| 49591.3497 | 2314.2 |
| 49601.5898 | 2342.59 |
| 49611.8298 | 2362.34 |
| 49622.0699 | 2373.92 |
| 49632.31 | 2379.14 |
| 49642.5501 | 2379.82 |
| 49652.7901 | 2377.78 |
| 49663.0302 | 2374.54 |
| 49673.2703 | 2370.48 |
| 49683.5104 | 2365.7 |
| 49693.7505 | 2360.3 |
| 49703.9905 | 2354.37 |
| 49714.2306 | 2348 |
| 49724.4707 | 2341.29 |
| 49734.7108 | 2334.34 |
| 49744.9508 | 2327.23 |
| 49755.1909 | 2320.07 |
| 49765.431 | 2312.96 |
| 49775.6711 | 2305.97 |
| 49785.9112 | 2299.22 |
| 49796.1512 | 2292.8 |
| 49806.3913 | 2286.8 |
| 49816.6314 | 2281.31 |
| 49826.8715 | 2276.43 |
| 49837.1115 | 2272.23 |
| 49847.3516 | 2268.67 |
| 49857.5917 | 2265.68 |
| 49867.8318 | 2263.18 |
| 49878.0719 | 2261.1 |
| 49888.3119 | 2259.38 |
| 49898.552 | 2257.95 |
| 49908.7921 | 2256.73 |
| 49919.0322 | 2255.67 |
| 49929.2722 | 2254.81 |
| 49939.5123 | 2254.2 |
| 49949.7524 | 2253.91 |
| 49959.9925 | 2253.98 |
| 49970.2325 | 2254.47 |
| 49980.4726 | 2255.44 |
| 49990.7127 | 2256.94 |
| 50000.9528 | 2259.02 |
| 50011.1929 | 2261.75 |
| 50021.4329 | 2265.18 |
| 50031.673 | 2269.36 |
| 50041.9131 | 2274.35 |
| 50052.1532 | 2280.21 |
| 50062.3932 | 2286.98 |
| 50072.6333 | 2294.73 |
| 50082.8734 | 2303.49 |
| 50093.1135 | 2313.17 |
| 50103.3536 | 2323.7 |
| 50113.5936 | 2334.95 |
| 50123.8337 | 2346.85 |
| 50134.0738 | 2359.28 |
| 50144.3139 | 2372.15 |
| 50154.5539 | 2385.36 |
| 50164.794 | 2398.82 |
| 50175.0341 | 2412.42 |
| 50185.2742 | 2426.06 |
| 50195.5142 | 2439.66 |
| 50205.7543 | 2453.1 |
| 50215.9944 | 2466.29 |
| 50226.2345 | 2479.13 |
| 50236.4746 | -9999 |
| 50246.7146 | -9999 |
| 50256.9547 | -9999 |
| 50267.1948 | -9999 |
| 50277.4349 | 2450.98 |
| 50287.6749 | 2401.71 |
| 50297.915 | 2352.44 |
| 50308.1551 | 2349.63 |
| 50318.3952 | 2335.55 |
| 50328.6353 | 2325.7 |
| 50338.8753 | 2320.07 |
| 50349.1154 | 2313.03 |
| 50359.3555 | 2305.99 |
| 50369.5956 | 2296.14 |
| 50379.8356 | 2296.14 |
| 50390.0757 | 2284.88 |
| 50400.3158 | 2283.47 |
| 50410.5559 | 2272.21 |
| 50420.796 | 2255.32 |
| 50431.036 | 2272.21 |
| 50441.2761 | 2267.99 |
| 50451.5162 | 2241.24 |
| 50461.7563 | 2235.61 |
| 50471.9963 | 2252.5 |
| 50482.2364 | 2238.43 |
| 50492.4765 | 2231.39 |
| 50502.7166 | 2231.39 |
| 50512.9566 | 2256.73 |
| 50523.1967 | 2255.32 |
| 50533.4368 | 2253.91 |
| 50543.6769 | 2252.5 |
| 50553.917 | 2242.65 |
| 50564.157 | 2258.13 |
| 50574.3971 | 2251.09 |
| 50584.6372 | 2235.61 |
| 50594.8773 | 2235.61 |
| 50605.1173 | 2234.2 |
| 50615.3574 | 2231.39 |
| 50625.5975 | 2228.57 |
| 50635.8376 | 2224.35 |
| 50646.0777 | 2221.53 |
| 50656.3177 | 2218.72 |
| 50666.5578 | 2215.9 |
| 50676.7979 | 2213.09 |
| 50687.038 | 2211.68 |
| 50697.278 | 2210.27 |
| 50707.5181 | 2208.87 |
| 50717.7582 | 2208.87 |
| 50727.9983 | 2213.09 |
| 50738.2384 | 2262.36 |
| 50748.4784 | 2259.54 |
| 50758.7185 | 2255.32 |
| 50768.9586 | 2253.91 |
| 50779.1987 | 2251.09 |
| 50789.4387 | 2252.5 |
| 50799.6788 | 2251.09 |
| 50809.9189 | 2251.09 |
| 50820.159 | 2249.69 |
| 50830.399 | 2249.69 |
| 50840.6391 | 2252.5 |
| 50850.8792 | 2249.69 |
| 50861.1193 | 2255.32 |
| 50871.3594 | 2255.32 |
| 50881.5994 | 2256.73 |
| 50891.8395 | 2260.95 |
| 50902.0796 | 2262.36 |
| 50912.3197 | 2269.39 |
| 50922.5597 | 2266.58 |
| 50932.7998 | 2272.21 |
| 50943.0399 | 2273.62 |
| 50953.28 | 2275.02 |
| 50963.5201 | 2241.24 |
| 50973.7601 | 2241.24 |
| 50984.0002 | 2241.24 |
| 50994.2403 | 2242.65 |
| 51004.4804 | 2242.65 |
| 51014.7204 | 2244.06 |
| 51024.9605 | 2253.91 |
| 51035.2006 | 2251.09 |
| 51045.4407 | 2251.09 |
| 51055.6808 | 2256.73 |
| 51065.9208 | 2258.13 |
| 51076.1609 | 2260.95 |
| 51086.401 | 2262.36 |
| 51096.6411 | 2265.17 |
| 51106.8811 | 2266.58 |
| 51117.1212 | 2270.8 |
| 51127.3613 | 2283.47 |
| 51137.6014 | 2318.66 |
| 51147.8414 | 2363.7 |
| 51158.0815 | 2396.08 |
| 51168.3216 | 2348.22 |
| 51178.5617 | 2349.63 |
| 51188.8018 | 2397.49 |
| 51199.0418 | 2366.52 |
| 51209.2819 | 2380.6 |
| 51219.522 | 2429.86 |
| 51229.7621 | 2391.86 |
| 51240.0021 | 2438.31 |
| 51250.2422 | 2442.53 |
| 51260.4823 | 2442.53 |
| 51270.7224 | 2479.13 |
| 51280.9625 | 2528.4 |
| 51291.2025 | 2524.17 |
| 51301.4426 | 2515.73 |
| 51311.6827 | 2514.32 |
| 51321.9228 | 2504.47 |
| 51332.1628 | 2500.24 |
| 51342.4029 | 2498.84 |
| 51352.643 | 2494.61 |
| 51362.8831 | 2497.43 |
| 51373.1232 | 2497.43 |
| 51383.3632 | 2496.02 |
| 51393.6033 | 2496.02 |
| 51403.8434 | 2496.02 |
| 51414.0835 | 2498.84 |
| 51424.3235 | 2498.84 |
| 51434.5636 | 2462.24 |
| 51444.8037 | 2417.19 |
| 51455.0438 | 2414.38 |
| 51465.2839 | 2382 |
| 51475.5239 | 2334.14 |
| 51485.764 | 2324.29 |
| 51496.0041 | 2322.88 |
| 51506.2442 | 2355.26 |
| 51516.4842 | 2307.4 |
| 51526.7243 | 2293.32 |
| 51536.9644 | 2291.92 |
| 51547.2045 | 2280.65 |
| 51557.4445 | 2277.84 |
| 51567.6846 | 2273.62 |
| 51577.9247 | 2267.99 |
| 51588.1648 | 2265.17 |
| 51598.4049 | 2262.36 |
| 51608.6449 | 2258.13 |
| 51618.885 | 2256.73 |
| 51629.1251 | 2256.73 |
| 51639.3652 | 2253.91 |
| 51649.6052 | 2251.09 |
| 51659.8453 | 2246.87 |
| 51670.0854 | 2246.87 |
| 51680.3255 | 2248.28 |
| 51690.5656 | 2249.69 |
| 51700.8056 | 2251.09 |
| 51711.0457 | 2228.57 |
| 51721.2858 | 2228.57 |
| 51731.5259 | 2220.13 |
| 51741.7659 | 2211.68 |
| 51752.006 | 2211.68 |
| 51762.2461 | 2218.72 |
| 51772.4862 | 2218.72 |
| 51782.7263 | 2203.24 |
| 51792.9663 | 2210.27 |
| 51803.2064 | 2207.46 |
| 51813.4465 | 2197.61 |
| 51823.6866 | 2200.42 |
| 51833.9266 | 2199.01 |
| 51844.1667 | 2200.42 |
| 51854.4068 | 2212.31 |
| 51864.6469 | 2221.97 |
| 51874.887 | 2229.56 |
| 51885.127 | 2235.25 |
| 51895.3671 | 2239.2 |
| 51905.6072 | 2241.56 |
| 51915.8473 | 2242.5 |
| 51926.0873 | 2242.19 |
| 51936.3274 | 2240.78 |
| 51946.5675 | 2238.43 |
| 51956.8076 | 2235.3 |
| 51967.0476 | 2231.57 |
| 51977.2877 | 2227.38 |
| 51987.5278 | 2222.9 |
| 51997.7679 | 2218.3 |
| 52008.008 | 2213.73 |
| 52018.248 | 2209.35 |
| 52028.4881 | 2205.33 |
| 52038.7282 | 2201.83 |
| 52048.9683 | 2199.01 |
| 52059.2083 | 2197 |
| 52069.4484 | 2195.76 |
| 52079.6885 | 2195.23 |
| 52089.9286 | 2195.36 |
| 52100.1687 | 2196.07 |
| 52110.4087 | 2197.31 |
| 52120.6488 | 2199.01 |
| 52130.8889 | 2201.1 |
| 52141.129 | 2203.53 |
| 52151.369 | 2206.23 |
| 52161.6091 | 2209.13 |
| 52171.8492 | 2212.18 |
| 52182.0893 | 2215.3 |
| 52192.3294 | 2218.44 |
| 52202.5694 | 2221.53 |
| 52212.8095 | 2224.52 |
| 52223.0496 | 2227.32 |
| 52233.2897 | 2229.89 |
| 52243.5297 | 2232.15 |
| 52253.7698 | 2234.05 |
| 52264.0099 | 2235.52 |
| 52274.25 | 2236.5 |
| 52284.4901 | 2236.92 |
| 52294.7301 | 2236.72 |
| 52304.9702 | 2235.83 |
| 52314.985 | 2234.2 |